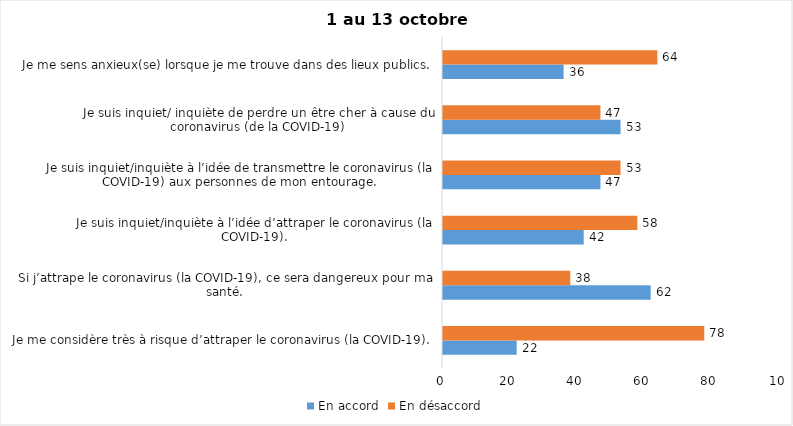
| Category | En accord | En désaccord |
|---|---|---|
| Je me considère très à risque d’attraper le coronavirus (la COVID-19). | 22 | 78 |
| Si j’attrape le coronavirus (la COVID-19), ce sera dangereux pour ma santé. | 62 | 38 |
| Je suis inquiet/inquiète à l’idée d’attraper le coronavirus (la COVID-19). | 42 | 58 |
| Je suis inquiet/inquiète à l’idée de transmettre le coronavirus (la COVID-19) aux personnes de mon entourage. | 47 | 53 |
| Je suis inquiet/ inquiète de perdre un être cher à cause du coronavirus (de la COVID-19) | 53 | 47 |
| Je me sens anxieux(se) lorsque je me trouve dans des lieux publics. | 36 | 64 |